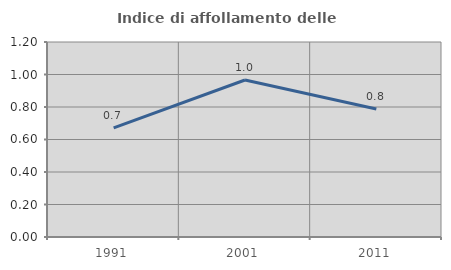
| Category | Indice di affollamento delle abitazioni  |
|---|---|
| 1991.0 | 0.671 |
| 2001.0 | 0.966 |
| 2011.0 | 0.787 |